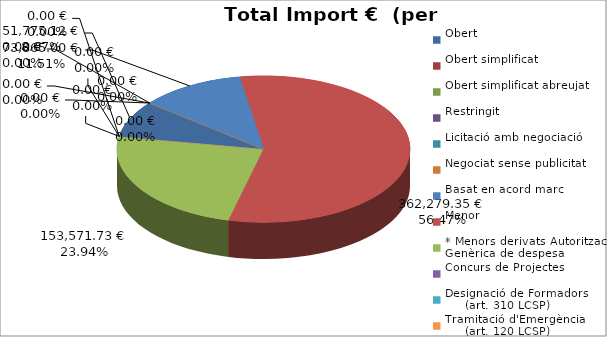
| Category | Total preu
(amb IVA) |
|---|---|
| Obert | 51775.12 |
| Obert simplificat | 0 |
| Obert simplificat abreujat | 0 |
| Restringit | 0 |
| Licitació amb negociació | 0 |
| Negociat sense publicitat | 0 |
| Basat en acord marc | 73865 |
| Menor | 362279.35 |
| * Menors derivats Autorització Genèrica de despesa | 153571.73 |
| Concurs de Projectes | 0 |
| Designació de Formadors
     (art. 310 LCSP) | 0 |
| Tramitació d'Emergència
     (art. 120 LCSP) | 0 |